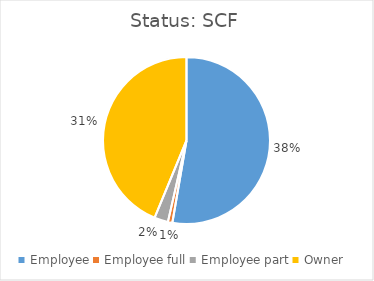
| Category | Status |
|---|---|
| Employee | 0.375 |
| Employee full | 0.006 |
| Employee part | 0.019 |
| Owner | 0.312 |